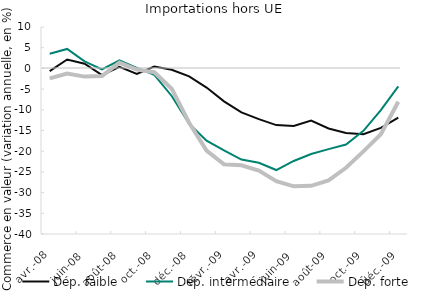
| Category | Dép. faible | Dép. intermédiaire | Dép. forte |
|---|---|---|---|
| 2008-04-01 | -0.651 | 3.543 | -2.397 |
| 2008-05-01 | 2.155 | 4.698 | -1.232 |
| 2008-06-01 | 1.121 | 1.712 | -1.984 |
| 2008-07-01 | -1.631 | -0.254 | -1.837 |
| 2008-08-01 | 0.358 | 1.949 | 1.41 |
| 2008-09-01 | -1.349 | 0.129 | -0.295 |
| 2008-10-01 | 0.467 | -1.576 | -0.917 |
| 2008-11-01 | -0.319 | -6.66 | -4.903 |
| 2008-12-01 | -1.942 | -13.381 | -13.112 |
| 2009-01-01 | -4.63 | -17.439 | -19.851 |
| 2009-02-01 | -7.954 | -19.806 | -23.18 |
| 2009-03-01 | -10.631 | -22.021 | -23.398 |
| 2009-04-01 | -12.262 | -22.805 | -24.679 |
| 2009-05-01 | -13.699 | -24.548 | -27.226 |
| 2009-06-01 | -13.93 | -22.363 | -28.479 |
| 2009-07-01 | -12.625 | -20.694 | -28.371 |
| 2009-08-01 | -14.505 | -19.503 | -27.041 |
| 2009-09-01 | -15.614 | -18.399 | -24.013 |
| 2009-10-01 | -15.902 | -15.067 | -20.052 |
| 2009-11-01 | -14.385 | -10.067 | -15.906 |
| 2009-12-01 | -11.892 | -4.332 | -8.07 |